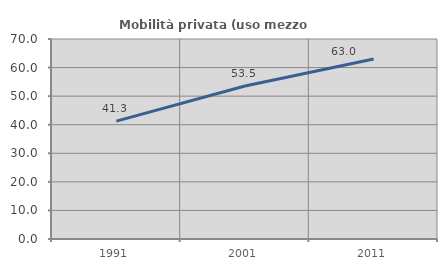
| Category | Mobilità privata (uso mezzo privato) |
|---|---|
| 1991.0 | 41.266 |
| 2001.0 | 53.547 |
| 2011.0 | 63.027 |